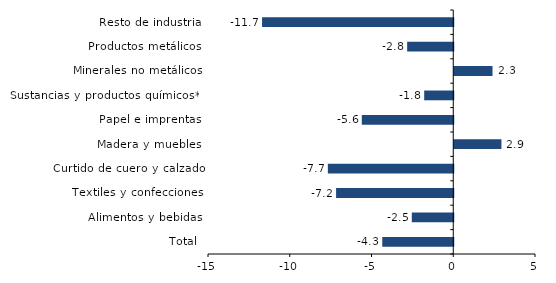
| Category | Series 0 |
|---|---|
| Total | -4.342 |
| Alimentos y bebidas | -2.535 |
| Textiles y confecciones | -7.167 |
| Curtido de cuero y calzado | -7.67 |
| Madera y muebles | 2.886 |
| Papel e imprentas | -5.593 |
| Sustancias y productos químicos** | -1.778 |
| Minerales no metálicos | 2.341 |
| Productos metálicos | -2.819 |
| Resto de industria | -11.694 |